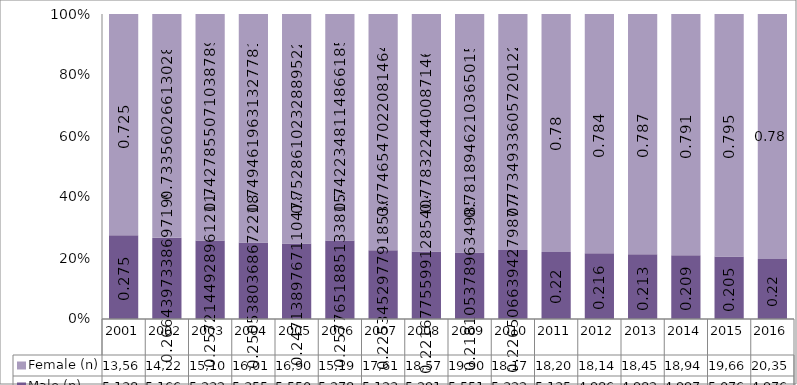
| Category | Male (n) | Female (n) |
|---|---|---|
| 2001.0 | 5138 | 13560 |
| 2002.0 | 5166 | 14223 |
| 2003.0 | 5232 | 15109 |
| 2004.0 | 5355 | 16019 |
| 2005.0 | 5550 | 16907 |
| 2006.0 | 5278 | 15198 |
| 2007.0 | 5123 | 17611 |
| 2008.0 | 5291 | 18577 |
| 2009.0 | 5551 | 19900 |
| 2010.0 | 5322 | 18174 |
| 2011.0 | 5135 | 18201 |
| 2012.0 | 4986 | 18146 |
| 2013.0 | 4982 | 18452 |
| 2014.0 | 4997 | 18948 |
| 2015.0 | 5076 | 19663 |
| 2016.0 | 4976 | 20351 |